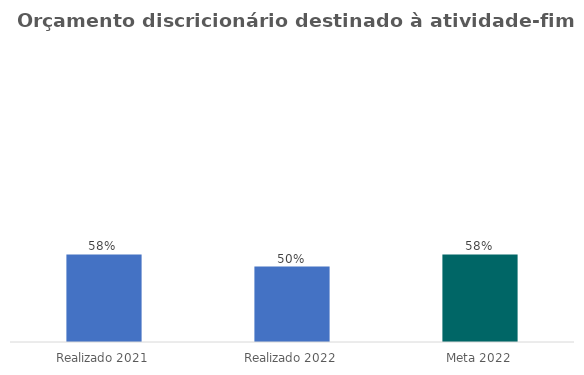
| Category | Series 0 |
|---|---|
| Realizado 2021 | 0.58 |
| Realizado 2022 | 0.5 |
| Meta 2022 | 0.58 |